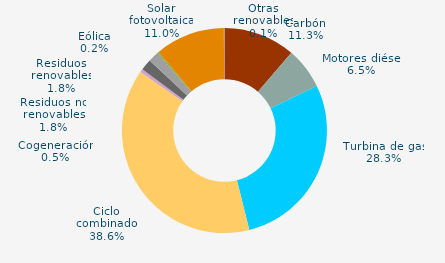
| Category | Series 0 |
|---|---|
| Carbón | 11.305 |
| Motores diésel | 6.534 |
| Turbina de gas | 28.267 |
| Ciclo combinado | 38.568 |
| Generación auxiliar | 0 |
| Cogeneración | 0.54 |
| Residuos no renovables | 1.753 |
| Residuos renovables | 1.753 |
| Eólica | 0.169 |
| Solar fotovoltaica | 11.012 |
| Otras renovables | 0.1 |